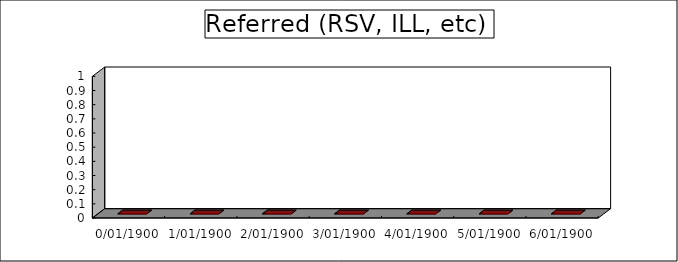
| Category | TOTAL |
|---|---|
| 0.0 | 0 |
| 1900-01-01 | 0 |
| 1900-01-02 | 0 |
| 1900-01-03 | 0 |
| 1900-01-04 | 0 |
| 1900-01-05 | 0 |
| 1900-01-06 | 0 |